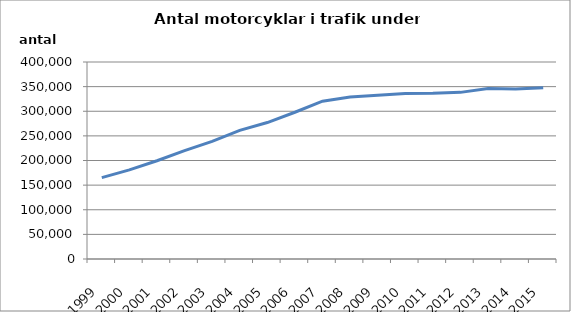
| Category | Series 0 |
|---|---|
| 1999.0 | 165310 |
| 2000.0 | 180915 |
| 2001.0 | 199451 |
| 2002.0 | 220079 |
| 2003.0 | 238981 |
| 2004.0 | 261214 |
| 2005.0 | 277039 |
| 2006.0 | 297983 |
| 2007.0 | 320392 |
| 2008.0 | 329084 |
| 2009.0 | 332561 |
| 2010.0 | 336197 |
| 2011.0 | 336439 |
| 2012.0 | 338339 |
| 2013.0 | 346314 |
| 2014.0 | 344988 |
| 2015.0 | 347906 |